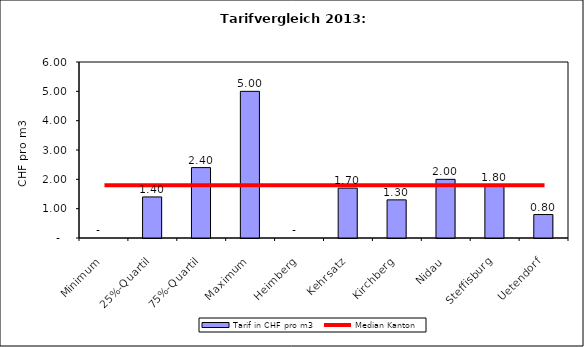
| Category | Tarif in CHF pro m3 |
|---|---|
| Minimum | 0 |
| 25%-Quartil | 1.4 |
| 75%-Quartil | 2.4 |
| Maximum | 5 |
| Heimberg | 0 |
| Kehrsatz | 1.7 |
| Kirchberg | 1.3 |
| Nidau | 2 |
| Steffisburg | 1.8 |
| Uetendorf | 0.8 |